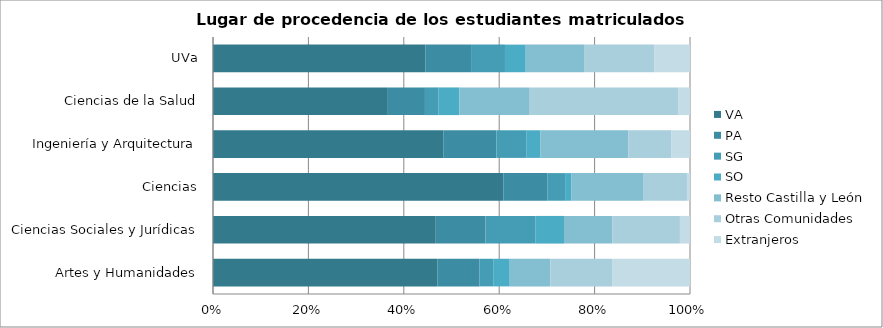
| Category | VA | PA | SG | SO | Resto Castilla y León | Otras Comunidades | Extranjeros |
|---|---|---|---|---|---|---|---|
| Artes y Humanidades | 856 | 160 | 52 | 63 | 155 | 235 | 297 |
| Ciencias Sociales y Jurídicas | 4488 | 1001 | 1012 | 570 | 973 | 1363 | 203 |
| Ciencias | 667 | 101 | 41 | 14 | 165 | 101 | 7 |
| Ingeniería y Arquitectura | 2108 | 487 | 277 | 124 | 806 | 396 | 169 |
| Ciencias de la Salud | 1052 | 229 | 83 | 125 | 421 | 904 | 69 |
| UVa | 9171 | 1978 | 1465 | 896 | 2520 | 3026 | 1551 |